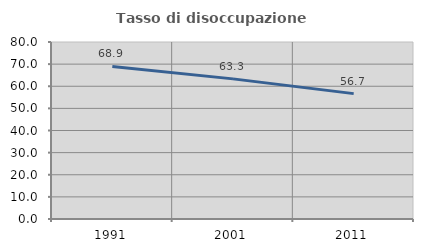
| Category | Tasso di disoccupazione giovanile  |
|---|---|
| 1991.0 | 68.942 |
| 2001.0 | 63.333 |
| 2011.0 | 56.667 |